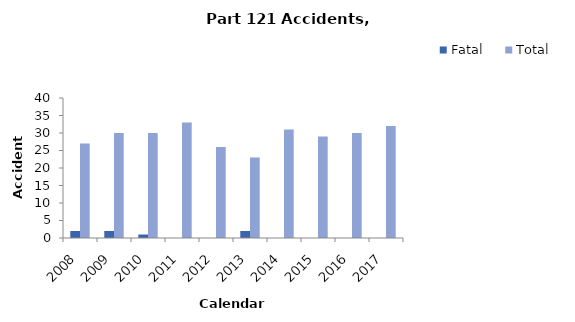
| Category | Fatal | Total |
|---|---|---|
| 2008.0 | 2 | 27 |
| 2009.0 | 2 | 30 |
| 2010.0 | 1 | 30 |
| 2011.0 | 0 | 33 |
| 2012.0 | 0 | 26 |
| 2013.0 | 2 | 23 |
| 2014.0 | 0 | 31 |
| 2015.0 | 0 | 29 |
| 2016.0 | 0 | 30 |
| 2017.0 | 0 | 32 |